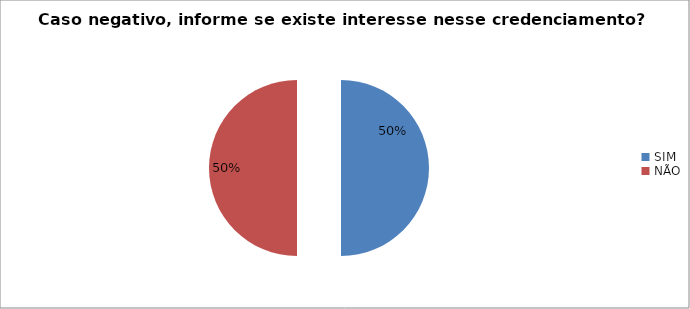
| Category | Series 0 |
|---|---|
| SIM | 0.5 |
| NÃO | 0.5 |